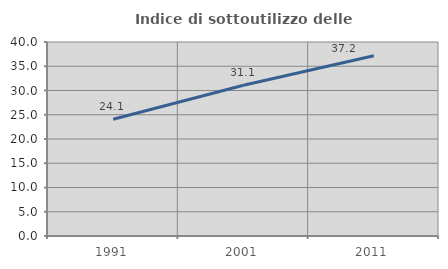
| Category | Indice di sottoutilizzo delle abitazioni  |
|---|---|
| 1991.0 | 24.058 |
| 2001.0 | 31.071 |
| 2011.0 | 37.155 |